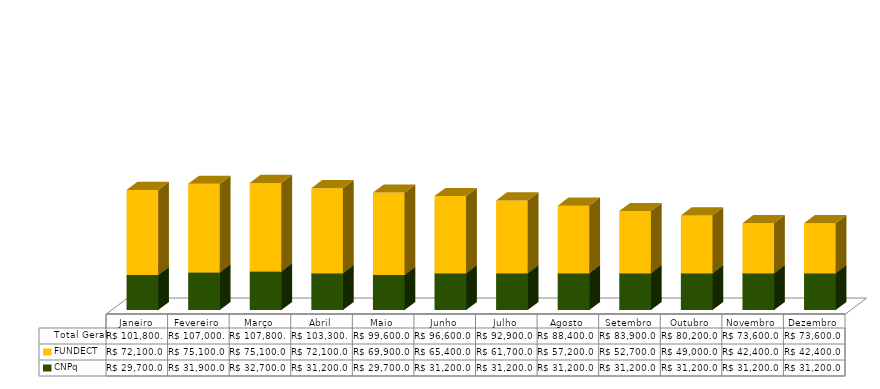
| Category | CNPq | FUNDECT | Total Geral |
|---|---|---|---|
| Janeiro | 29700 | 72100 | 101800 |
| Fevereiro | 31900 | 75100 | 107000 |
| Março | 32700 | 75100 | 107800 |
| Abril | 31200 | 72100 | 103300 |
| Maio | 29700 | 69900 | 99600 |
| Junho | 31200 | 65400 | 96600 |
| Julho | 31200 | 61700 | 92900 |
| Agosto | 31200 | 57200 | 88400 |
| Setembro | 31200 | 52700 | 83900 |
| Outubro | 31200 | 49000 | 80200 |
| Novembro | 31200 | 42400 | 73600 |
| Dezembro | 31200 | 42400 | 73600 |